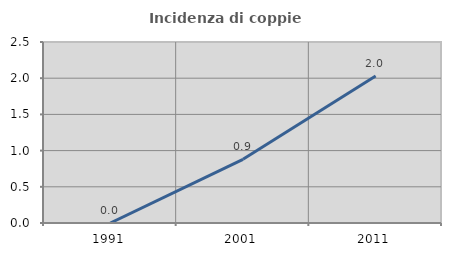
| Category | Incidenza di coppie miste |
|---|---|
| 1991.0 | 0 |
| 2001.0 | 0.88 |
| 2011.0 | 2.03 |